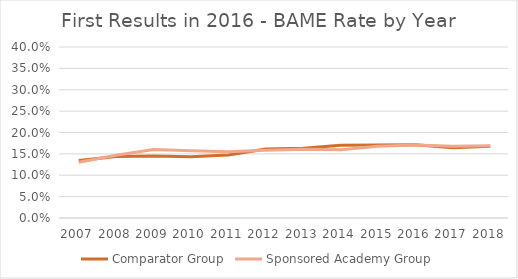
| Category | Comparator Group | Sponsored Academy Group |
|---|---|---|
| 2007.0 | 0.134 | 0.131 |
| 2008.0 | 0.144 | 0.147 |
| 2009.0 | 0.145 | 0.16 |
| 2010.0 | 0.143 | 0.157 |
| 2011.0 | 0.147 | 0.155 |
| 2012.0 | 0.161 | 0.158 |
| 2013.0 | 0.163 | 0.161 |
| 2014.0 | 0.17 | 0.16 |
| 2015.0 | 0.171 | 0.168 |
| 2016.0 | 0.171 | 0.17 |
| 2017.0 | 0.164 | 0.168 |
| 2018.0 | 0.168 | 0.169 |